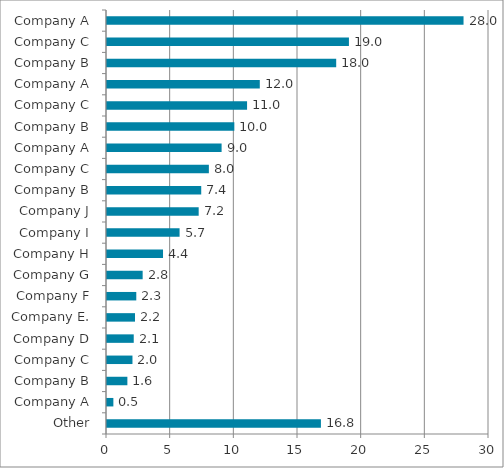
| Category | Series 0 |
|---|---|
| Other | 16.8 |
| Company A | 0.5 |
| Company B | 1.6 |
| Company C | 2 |
| Company D | 2.1 |
| Company E. | 2.2 |
| Company F | 2.3 |
| Company G | 2.8 |
| Company H | 4.4 |
| Company I | 5.7 |
| Company J | 7.2 |
| Company B | 7.4 |
| Company C | 8 |
| Company A | 9 |
| Company B | 10 |
| Company C | 11 |
| Company A | 12 |
| Company B | 18 |
| Company C | 19 |
| Company A | 28 |